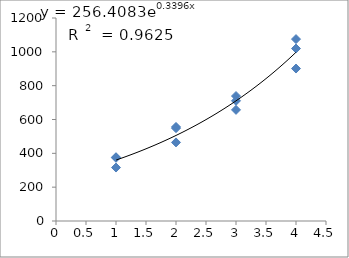
| Category | Series 0 |
|---|---|
| 1.0 | 377.08 |
| 1.0 | 315.979 |
| 1.0 | 373.589 |
| 2.0 | 555.992 |
| 2.0 | 548.676 |
| 2.0 | 464.546 |
| 3.0 | 656.942 |
| 3.0 | 738.708 |
| 3.0 | 710.513 |
| 4.0 | 901.27 |
| 4.0 | 1075.261 |
| 4.0 | 1019.584 |